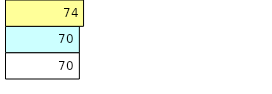
| Category | Total Standouts | Total Recd | Total Tipsters |
|---|---|---|---|
| 0 | 70 | 70 | 74 |